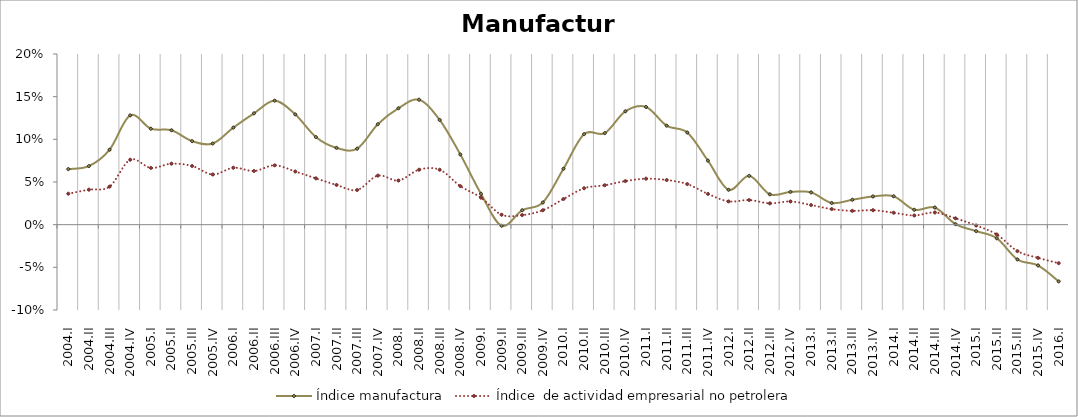
| Category | Índice manufactura | Índice  de actividad empresarial no petrolera |
|---|---|---|
| 2004.I | 0.065 | 0.036 |
| 2004.II | 0.069 | 0.041 |
| 2004.III | 0.088 | 0.045 |
| 2004.IV | 0.128 | 0.076 |
| 2005.I | 0.112 | 0.066 |
| 2005.II | 0.111 | 0.071 |
| 2005.III | 0.098 | 0.069 |
| 2005.IV | 0.095 | 0.059 |
| 2006.I | 0.114 | 0.067 |
| 2006.II | 0.13 | 0.063 |
| 2006.III | 0.145 | 0.07 |
| 2006.IV | 0.129 | 0.062 |
| 2007.I | 0.103 | 0.054 |
| 2007.II | 0.09 | 0.047 |
| 2007.III | 0.089 | 0.041 |
| 2007.IV | 0.118 | 0.057 |
| 2008.I | 0.136 | 0.052 |
| 2008.II | 0.146 | 0.064 |
| 2008.III | 0.123 | 0.064 |
| 2008.IV | 0.082 | 0.045 |
| 2009.I | 0.036 | 0.032 |
| 2009.II | -0.001 | 0.012 |
| 2009.III | 0.017 | 0.011 |
| 2009.IV | 0.026 | 0.017 |
| 2010.I | 0.066 | 0.03 |
| 2010.II | 0.106 | 0.043 |
| 2010.III | 0.107 | 0.046 |
| 2010.IV | 0.133 | 0.051 |
| 2011.I | 0.138 | 0.054 |
| 2011.II | 0.116 | 0.052 |
| 2011.III | 0.108 | 0.048 |
| 2011.IV | 0.075 | 0.036 |
| 2012.I | 0.041 | 0.027 |
| 2012.II | 0.057 | 0.029 |
| 2012.III | 0.036 | 0.025 |
| 2012.IV | 0.038 | 0.027 |
| 2013.I | 0.038 | 0.023 |
| 2013.II | 0.025 | 0.018 |
| 2013.III | 0.029 | 0.016 |
| 2013.IV | 0.033 | 0.017 |
| 2014.I | 0.033 | 0.014 |
| 2014.II | 0.017 | 0.011 |
| 2014.III | 0.02 | 0.014 |
| 2014.IV | 0.001 | 0.007 |
| 2015.I | -0.008 | -0.001 |
| 2015.II | -0.016 | -0.012 |
| 2015.III | -0.041 | -0.031 |
| 2015.IV | -0.048 | -0.039 |
| 2016.I | -0.066 | -0.045 |